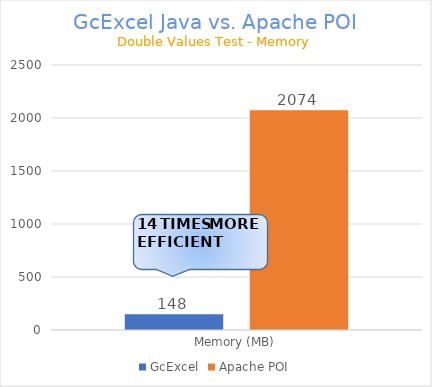
| Category | GcExcel | Apache POI |
|---|---|---|
| Memory (MB) | 147.678 | 2073.828 |